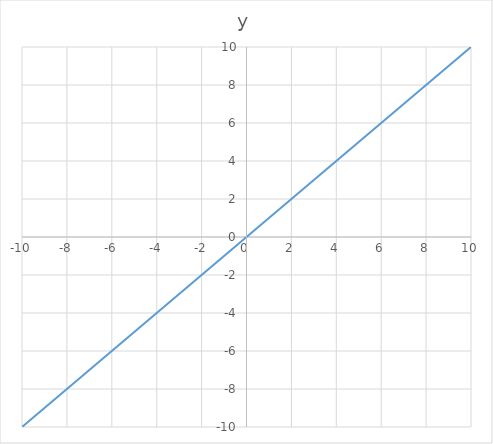
| Category | y |
|---|---|
| -10.0 | -10 |
| -9.0 | -9 |
| -8.0 | -8 |
| -7.0 | -7 |
| -6.0 | -6 |
| -5.0 | -5 |
| -4.0 | -4 |
| -3.0 | -3 |
| -2.0 | -2 |
| -1.0 | -1 |
| 0.0 | 0 |
| 1.0 | 1 |
| 2.0 | 2 |
| 3.0 | 3 |
| 4.0 | 4 |
| 5.0 | 5 |
| 6.0 | 6 |
| 7.0 | 7 |
| 8.0 | 8 |
| 9.0 | 9 |
| 10.0 | 10 |